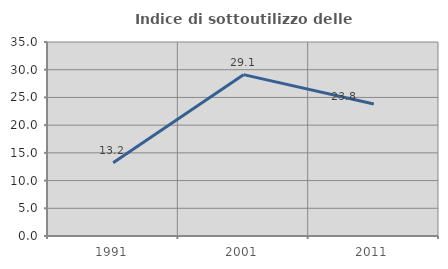
| Category | Indice di sottoutilizzo delle abitazioni  |
|---|---|
| 1991.0 | 13.224 |
| 2001.0 | 29.112 |
| 2011.0 | 23.827 |